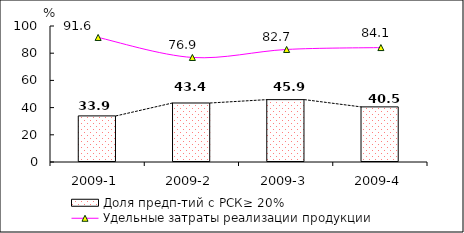
| Category | Доля предп-тий с РСК≥ 20% |
|---|---|
| 2009-1 | 33.896 |
| 2009-2 | 43.392 |
| 2009-3 | 45.858 |
| 2009-4 | 40.531 |